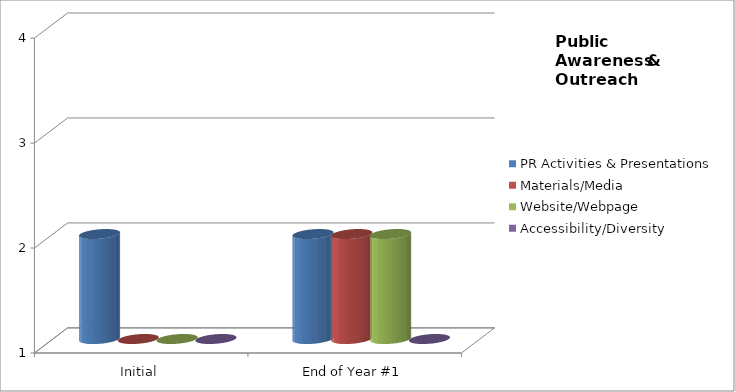
| Category | PR Activities & Presentations  | Materials/Media  | Website/Webpage  | Accessibility/Diversity  |
|---|---|---|---|---|
| Initial | 2 | 1 | 1 | 1 |
| End of Year #1 | 2 | 2 | 2 | 1 |